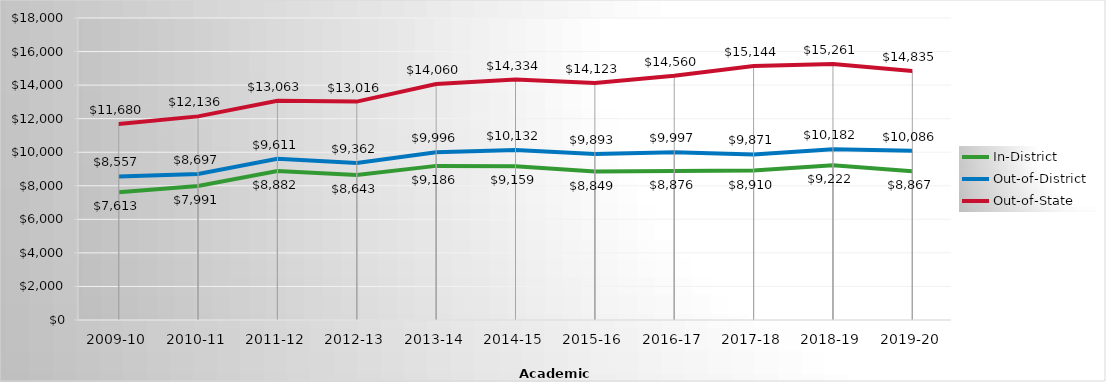
| Category | In-District | Out-of-District | Out-of-State |
|---|---|---|---|
| 2009-10 | 7613 | 8557 | 11680 |
| 2010-11 | 7991 | 8697 | 12136 |
| 2011-12 | 8882 | 9611 | 13063 |
| 2012-13 | 8643.15 | 9362 | 13016 |
| 2013-14 | 9185.83 | 9996.06 | 14060.13 |
| 2014-15 | 9159.04 | 10132.13 | 14333.65 |
| 2015-16 | 8849 | 9893 | 14123 |
| 2016-17 | 8876 | 9997 | 14560 |
| 2017-18 | 8910 | 9871 | 15144 |
| 2018-19 | 9222 | 10182 | 15261 |
| 2019-20 | 8867 | 10086 | 14835 |